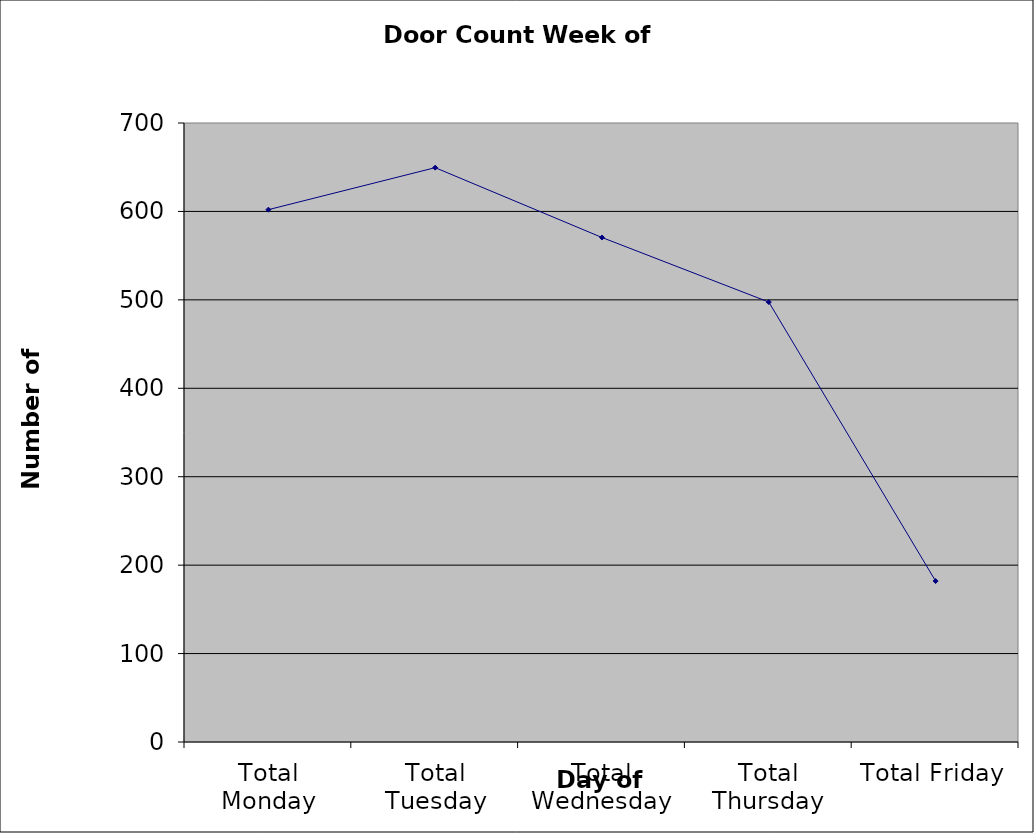
| Category | Series 0 |
|---|---|
| Total Monday | 602 |
| Total Tuesday | 649.5 |
| Total Wednesday | 570.5 |
| Total Thursday | 497.5 |
| Total Friday | 182 |